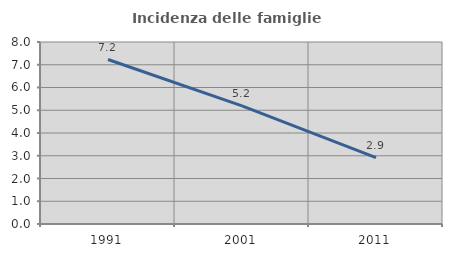
| Category | Incidenza delle famiglie numerose |
|---|---|
| 1991.0 | 7.23 |
| 2001.0 | 5.191 |
| 2011.0 | 2.916 |